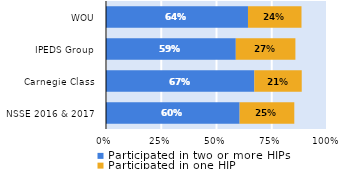
| Category | Participated in two or more HIPs | Participated in one HIP |
|---|---|---|
| NSSE 2016 & 2017 | 0.605 | 0.247 |
| Carnegie Class | 0.671 | 0.215 |
| IPEDS Group | 0.587 | 0.27 |
| WOU | 0.642 | 0.242 |